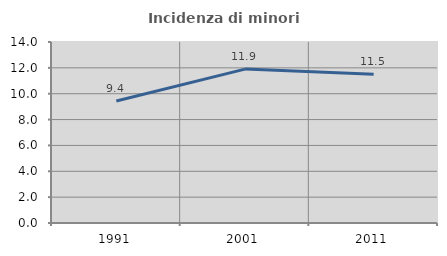
| Category | Incidenza di minori stranieri |
|---|---|
| 1991.0 | 9.434 |
| 2001.0 | 11.905 |
| 2011.0 | 11.502 |